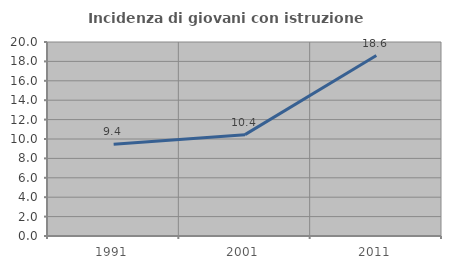
| Category | Incidenza di giovani con istruzione universitaria |
|---|---|
| 1991.0 | 9.449 |
| 2001.0 | 10.448 |
| 2011.0 | 18.605 |